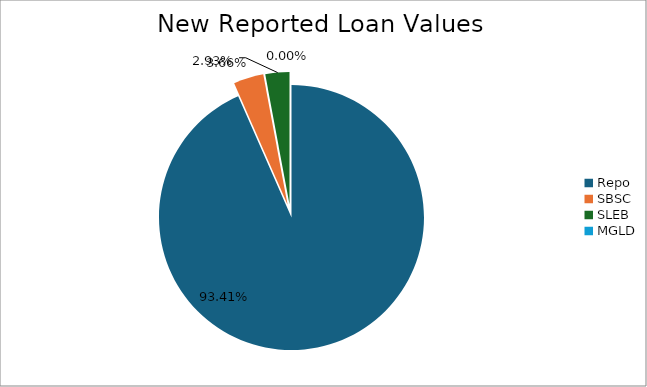
| Category | Series 0 |
|---|---|
| Repo | 14333589.34 |
| SBSC | 561555.958 |
| SLEB | 449749.058 |
| MGLD | 337.13 |